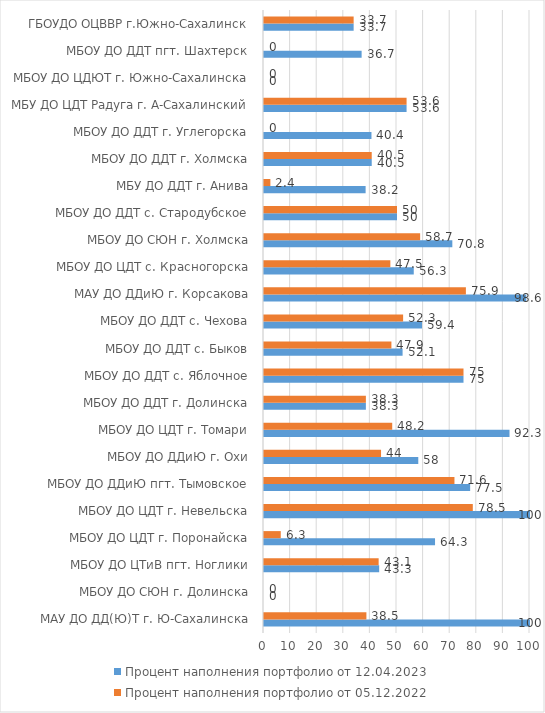
| Category | Процент наполнения портфолио от 12.04.2023 | Процент наполнения портфолио от 05.12.2022 |
|---|---|---|
| МАУ ДО ДД(Ю)Т г. Ю-Сахалинска | 100 | 38.5 |
| МБОУ ДО СЮН г. Долинска | 0 | 0 |
| МБОУ ДО ЦТиВ пгт. Ноглики | 43.3 | 43.1 |
| МБОУ ДО ЦДТ г. Поронайска | 64.3 | 6.3 |
| МБОУ ДО ЦДТ г. Невельска | 100 | 78.5 |
| МБОУ ДО ДДиЮ пгт. Тымовское | 77.5 | 71.6 |
| МБОУ ДО ДДиЮ г. Охи | 58 | 44 |
| МБОУ ДО ЦДТ г. Томари | 92.3 | 48.2 |
| МБОУ ДО ДДТ г. Долинска | 38.3 | 38.3 |
| МБОУ ДО ДДТ с. Яблочное | 75 | 75 |
| МБОУ ДО ДДТ с. Быков | 52.1 | 47.9 |
| МБОУ ДО ДДТ с. Чехова | 59.4 | 52.3 |
| МАУ ДО ДДиЮ г. Корсакова | 98.6 | 75.9 |
| МБОУ ДО ЦДТ с. Красногорска | 56.3 | 47.5 |
| МБОУ ДО СЮН г. Холмска | 70.8 | 58.7 |
| МБОУ ДО ДДТ с. Стародубское | 50 | 50 |
| МБУ ДО ДДТ г. Анива | 38.2 | 2.4 |
| МБОУ ДО ДДТ г. Холмска | 40.5 | 40.5 |
| МБОУ ДО ДДТ г. Углегорска | 40.4 | 0 |
| МБУ ДО ЦДТ Радуга г. А-Сахалинский | 53.6 | 53.6 |
| МБОУ ДО ЦДЮТ г. Южно-Сахалинска | 0 | 0 |
| МБОУ ДО ДДТ пгт. Шахтерск | 36.7 | 0 |
| ГБОУДО ОЦВВР г.Южно-Сахалинск | 33.7 | 33.7 |